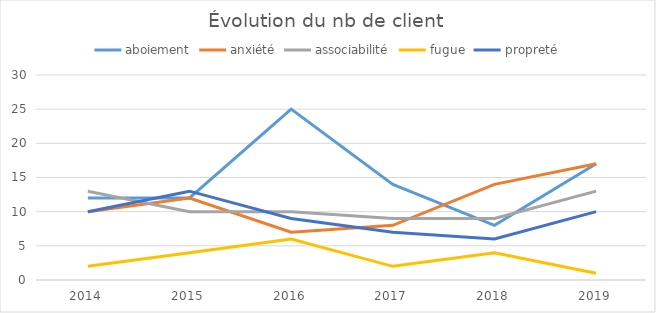
| Category | aboiement | anxiété | associabilité | fugue | propreté |
|---|---|---|---|---|---|
| 2014 | 12 | 10 | 13 | 2 | 10 |
| 2015 | 12 | 12 | 10 | 4 | 13 |
| 2016 | 25 | 7 | 10 | 6 | 9 |
| 2017 | 14 | 8 | 9 | 2 | 7 |
| 2018 | 8 | 14 | 9 | 4 | 6 |
| 2019 | 17 | 17 | 13 | 1 | 10 |